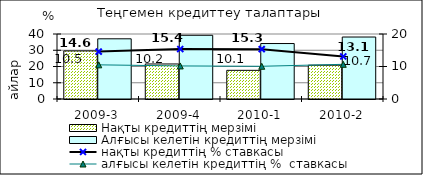
| Category | Нақты кредиттің мерзімі  | Алғысы келетін кредиттің мерзімі  |
|---|---|---|
| 2009-3 | 29.58 | 37.04 |
| 2009-4 | 21.55 | 39.22 |
| 2010-1 | 17.64 | 34.13 |
| 2010-2 | 20.81 | 38.14 |